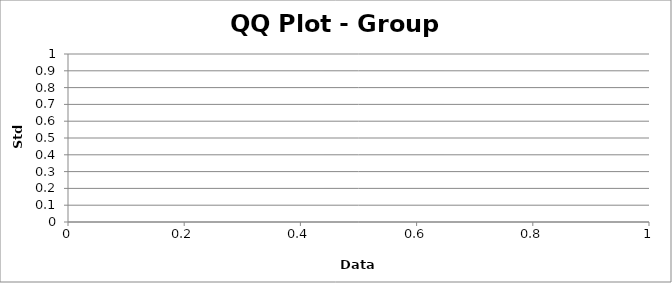
| Category | Series 0 |
|---|---|
| 0.0 | 0 |
| 0.0 | 0 |
| 0.0 | 0 |
| 0.0 | 0 |
| 0.0 | 0 |
| 0.0 | 0 |
| 0.0 | 0 |
| 0.0 | 0 |
| 0.0 | 0 |
| 0.0 | 0 |
| 0.0 | 0 |
| 0.0 | 0 |
| 0.0 | 0 |
| 0.0 | 0 |
| 0.0 | 0 |
| 0.0 | 0 |
| 0.0 | 0 |
| 0.0 | 0 |
| 0.0 | 0 |
| 0.0 | 0 |
| 0.0 | 0 |
| 0.0 | 0 |
| 0.0 | 0 |
| 0.0 | 0 |
| 0.0 | 0 |
| 0.0 | 0 |
| 0.0 | 0 |
| 0.0 | 0 |
| 0.0 | 0 |